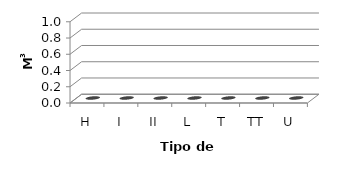
| Category | Series 0 |
|---|---|
| H | 0 |
| I | 0 |
| II | 0 |
| L | 0 |
| T | 0 |
| TT | 0 |
| U | 0 |